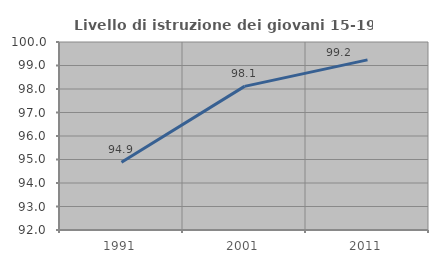
| Category | Livello di istruzione dei giovani 15-19 anni |
|---|---|
| 1991.0 | 94.882 |
| 2001.0 | 98.113 |
| 2011.0 | 99.238 |